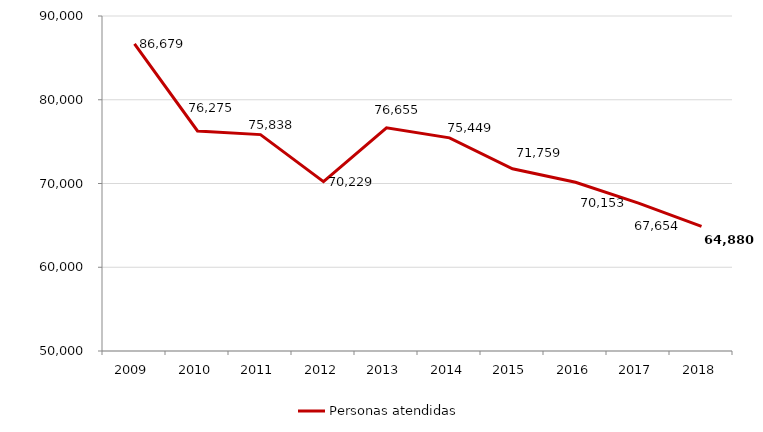
| Category | Personas atendidas |
|---|---|
| 2009.0 | 86679 |
| 2010.0 | 76275 |
| 2011.0 | 75838 |
| 2012.0 | 70229 |
| 2013.0 | 76655 |
| 2014.0 | 75449 |
| 2015.0 | 71759 |
| 2016.0 | 70153 |
| 2017.0 | 67654 |
| 2018.0 | 64880 |